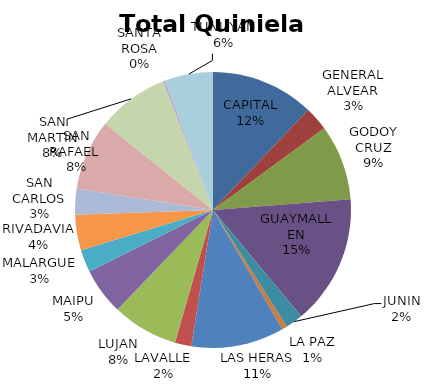
| Category | Total Quiniela Beneficio |
|---|---|
| CAPITAL | 1815156.47 |
| GENERAL ALVEAR | 419044.91 |
| GODOY CRUZ | 1324451.91 |
| GUAYMALLEN | 2279334.62 |
| JUNIN | 305940.02 |
| LA PAZ | 89675.93 |
| LAS HERAS | 1631783.1 |
| LAVALLE | 288662.88 |
| LUJAN | 1156150.85 |
| MAIPU | 822510.62 |
| MALARGUE | 392531.11 |
| RIVADAVIA | 625111.24 |
| SAN CARLOS | 454699.71 |
| SAN MARTIN | 1234214.1 |
| SAN RAFAEL  | 1250419.01 |
| SANTA ROSA | -45447.86 |
| TUNUYAN | 841016.81 |